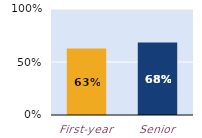
| Category | substantially |
|---|---|
| First-year | 0.627 |
| Senior | 0.684 |